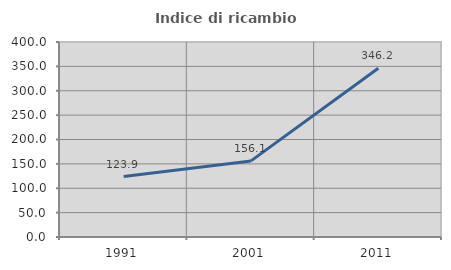
| Category | Indice di ricambio occupazionale  |
|---|---|
| 1991.0 | 123.923 |
| 2001.0 | 156.11 |
| 2011.0 | 346.154 |